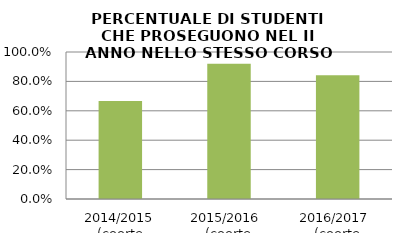
| Category | 2014/2015 (coorte 2013/14) 2015/2016  (coorte 2014/15) 2016/2017  (coorte 2015/16) |
|---|---|
| 2014/2015 (coorte 2013/14) | 0.667 |
| 2015/2016  (coorte 2014/15) | 0.92 |
| 2016/2017  (coorte 2015/16) | 0.842 |